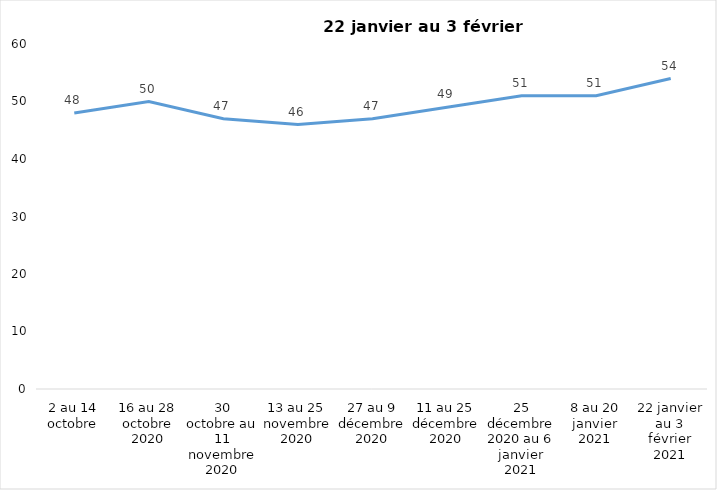
| Category | Toujours aux trois mesures |
|---|---|
| 2 au 14 octobre | 48 |
| 16 au 28 octobre 2020 | 50 |
| 30 octobre au 11 novembre 2020 | 47 |
| 13 au 25 novembre 2020 | 46 |
| 27 au 9 décembre 2020 | 47 |
| 11 au 25 décembre 2020 | 49 |
| 25 décembre 2020 au 6 janvier 2021 | 51 |
| 8 au 20 janvier 2021 | 51 |
| 22 janvier au 3 février 2021 | 54 |